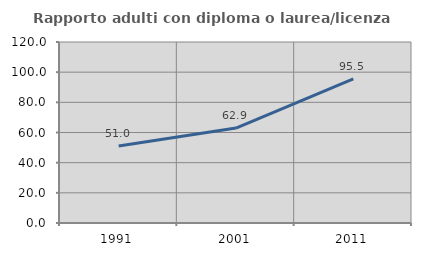
| Category | Rapporto adulti con diploma o laurea/licenza media  |
|---|---|
| 1991.0 | 51.037 |
| 2001.0 | 62.935 |
| 2011.0 | 95.521 |